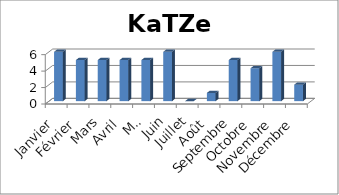
| Category | KaTZe |
|---|---|
| Janvier | 6 |
| Février | 5 |
| Mars | 5 |
| Avril | 5 |
| Mai | 5 |
| Juin | 6 |
| Juillet | 0 |
| Août | 1 |
| Septembre | 5 |
| Octobre | 4 |
| Novembre | 6 |
| Décembre | 2 |